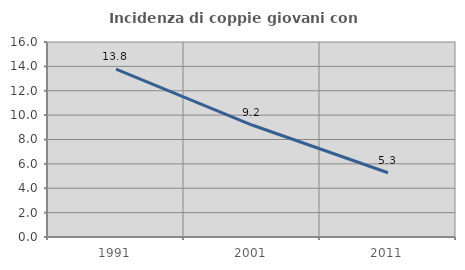
| Category | Incidenza di coppie giovani con figli |
|---|---|
| 1991.0 | 13.783 |
| 2001.0 | 9.188 |
| 2011.0 | 5.271 |